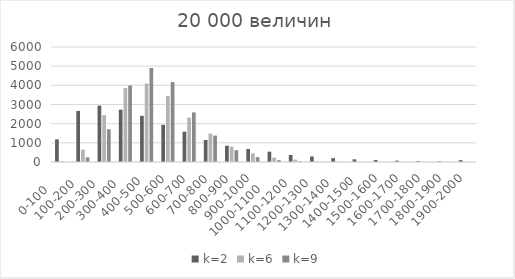
| Category | k=2 | k=6 | k=9 |
|---|---|---|---|
| 0-100     | 1182 | 41 | 2 |
| 100-200   | 2663 | 645 | 239 |
| 200-300   | 2940 | 2443 | 1706 |
| 300-400   | 2731 | 3855 | 3995 |
| 400-500  | 2409 | 4094 | 4906 |
| 500-600 | 1941 | 3446 | 4170 |
| 600-700 | 1581 | 2317 | 2588 |
| 700-800 | 1148 | 1481 | 1377 |
| 800-900 | 849 | 802 | 616 |
| 900-1000 | 676 | 456 | 251 |
| 1000-1100     | 537 | 229 | 95 |
| 1100-1200   | 369 | 124 | 37 |
| 1200-1300   | 288 | 37 | 13 |
| 1300-1400   | 201 | 12 | 5 |
| 1400-1500  | 140 | 10 | 0 |
| 1500-1600 | 102 | 6 | 0 |
| 1600-1700 | 70 | 2 | 0 |
| 1700-1800 | 43 | 0 | 0 |
| 1800-1900 | 33 | 0 | 0 |
| 1900-2000 | 97 | 0 | 0 |